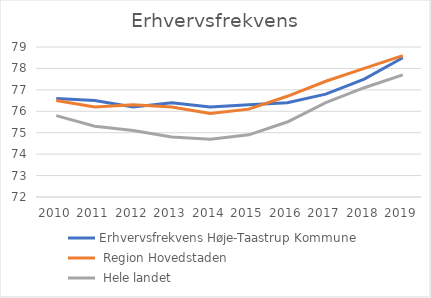
| Category | Erhvervsfrekvens |
|---|---|
| 2010.0 | 75.8 |
| 2011.0 | 75.3 |
| 2012.0 | 75.1 |
| 2013.0 | 74.8 |
| 2014.0 | 74.7 |
| 2015.0 | 74.9 |
| 2016.0 | 75.5 |
| 2017.0 | 76.4 |
| 2018.0 | 77.1 |
| 2019.0 | 77.7 |